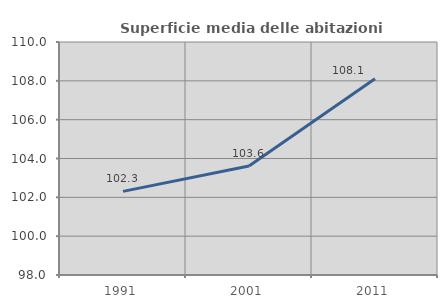
| Category | Superficie media delle abitazioni occupate |
|---|---|
| 1991.0 | 102.305 |
| 2001.0 | 103.617 |
| 2011.0 | 108.109 |